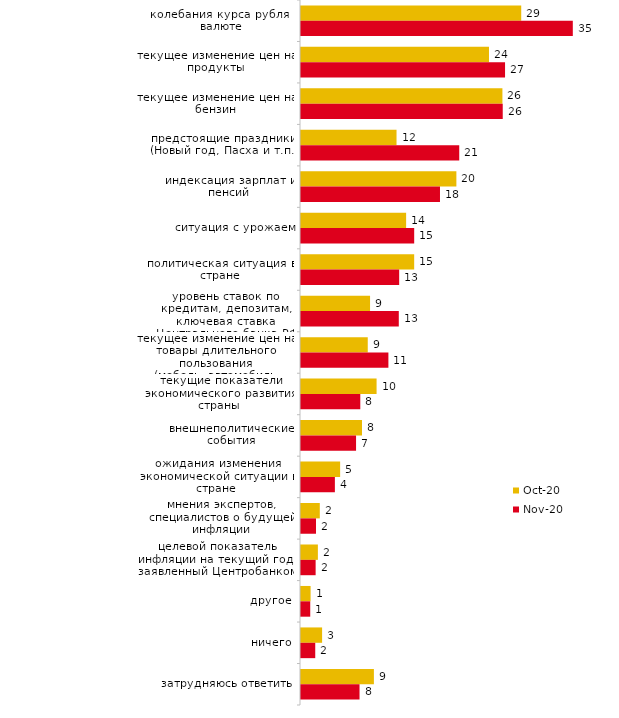
| Category | окт.20 | ноя.20 |
|---|---|---|
| колебания курса рубля к валюте | 28.6 | 35.3 |
| текущее изменение цен на продукты | 24.415 | 26.5 |
| текущее изменение цен на бензин | 26.158 | 26.2 |
| предстоящие праздники (Новый год, Пасха и т.п.) | 12.407 | 20.55 |
| индексация зарплат и пенсий | 20.179 | 18.05 |
| ситуация с урожаем | 13.652 | 14.7 |
| политическая ситуация в стране | 14.699 | 12.75 |
| уровень ставок по кредитам, депозитам, ключевая ставка Центрального банка РФ | 8.969 | 12.7 |
| текущее изменение цен на товары длительного пользования (мебель, автомобиль, бытовая техника и т.п.) | 8.67 | 11.35 |
| текущие показатели экономического развития страны | 9.816 | 7.7 |
| внешнеполитические события | 7.922 | 7.15 |
| ожидания изменения экономической ситуации в стране | 5.082 | 4.4 |
| мнения экспертов, специалистов о будущей инфляции | 2.441 | 1.95 |
| целевой показатель инфляции на текущий год, заявленный Центробанком | 2.192 | 1.9 |
| другое | 1.246 | 1.2 |
| ничего | 2.74 | 1.85 |
| затрудняюсь ответить | 9.467 | 7.6 |